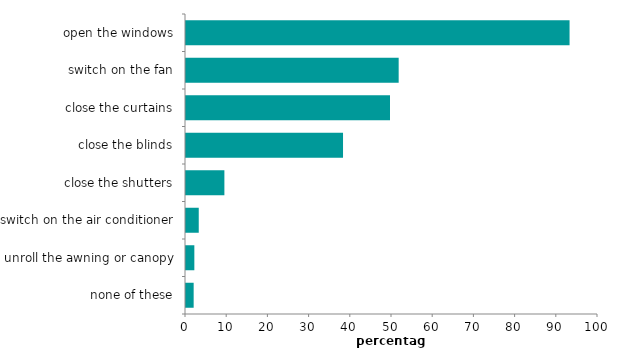
| Category | Series 0 |
|---|---|
| none of these | 1.858 |
| unroll the awning or canopy | 2.025 |
| switch on the air conditioner | 3.094 |
| close the shutters | 9.317 |
| close the blinds | 38.114 |
| close the curtains | 49.515 |
| switch on the fan | 51.619 |
| open the windows | 93.097 |